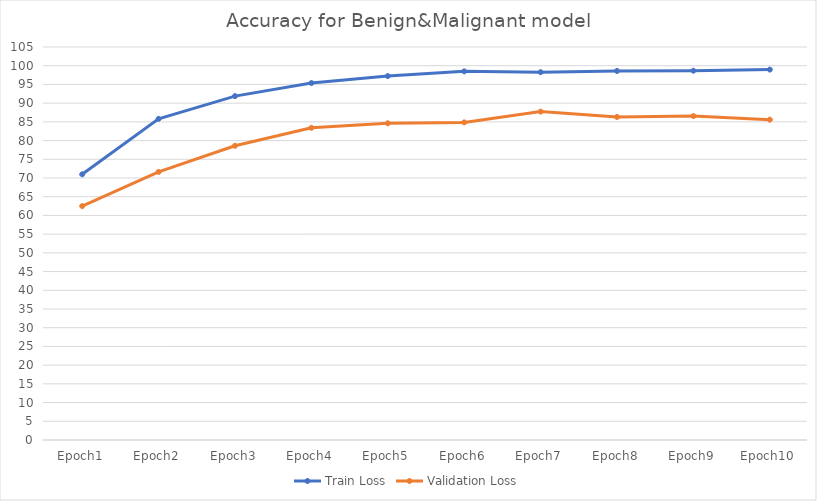
| Category | Train Loss | Validation Loss |
|---|---|---|
| Epoch1 | 70.99 | 62.5 |
| Epoch2 | 85.8 | 71.63 |
| Epoch3 | 91.88 | 78.61 |
| Epoch4 | 95.36 | 83.41 |
| Epoch5 | 97.23 | 84.62 |
| Epoch6 | 98.49 | 84.86 |
| Epoch7 | 98.27 | 87.74 |
| Epoch8 | 98.6 | 86.3 |
| Epoch9 | 98.67 | 86.54 |
| Epoch10 | 98.96 | 85.58 |